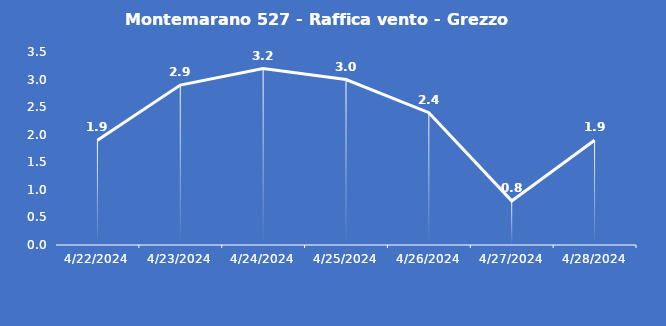
| Category | Montemarano 527 - Raffica vento - Grezzo (m/s) |
|---|---|
| 4/22/24 | 1.9 |
| 4/23/24 | 2.9 |
| 4/24/24 | 3.2 |
| 4/25/24 | 3 |
| 4/26/24 | 2.4 |
| 4/27/24 | 0.8 |
| 4/28/24 | 1.9 |